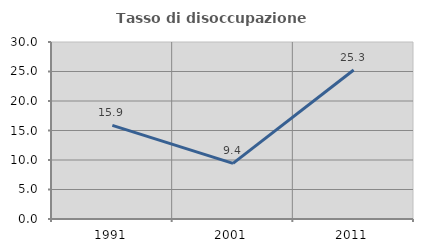
| Category | Tasso di disoccupazione giovanile  |
|---|---|
| 1991.0 | 15.875 |
| 2001.0 | 9.424 |
| 2011.0 | 25.253 |